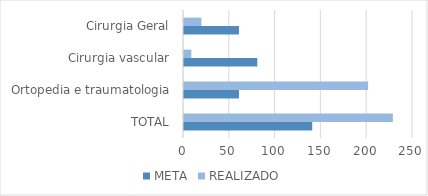
| Category | META | REALIZADO |
|---|---|---|
| TOTAL | 140 | 228 |
| Ortopedia e traumatologia | 60 | 201 |
| Cirurgia vascular | 80 | 8 |
| Cirurgia Geral | 60 | 19 |